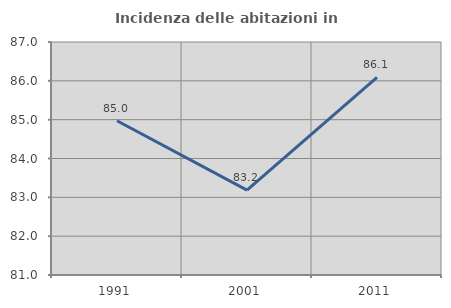
| Category | Incidenza delle abitazioni in proprietà  |
|---|---|
| 1991.0 | 84.971 |
| 2001.0 | 83.186 |
| 2011.0 | 86.09 |